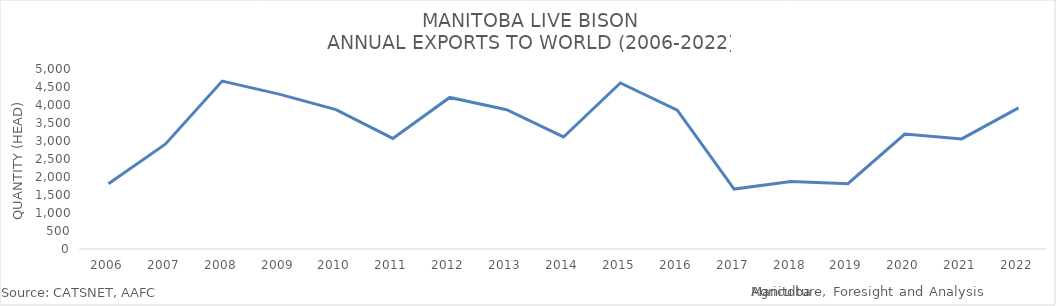
| Category | Series 0 |
|---|---|
| 2006 | 1813 |
| 2007 | 2911 |
| 2008 | 4664 |
| 2009 | 4303 |
| 2010 | 3872 |
| 2011 | 3072 |
| 2012 | 4210 |
| 2013 | 3870 |
| 2014 | 3112 |
| 2015 | 4613 |
| 2016 | 3857 |
| 2017 | 1665 |
| 2018 | 1878 |
| 2019 | 1813 |
| 2020 | 3194 |
| 2021 | 3059 |
| 2022 | 3921 |